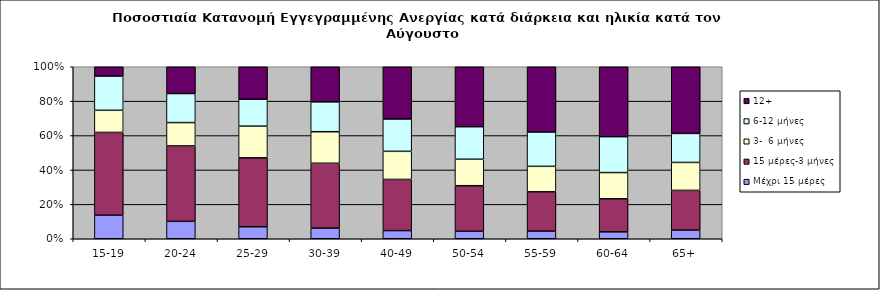
| Category | Μέχρι 15 μέρες | 15 μέρες-3 μήνες | 3-  6 μήνες | 6-12 μήνες | 12+ |
|---|---|---|---|---|---|
| 15-19 | 0.137 | 0.481 | 0.129 | 0.199 | 0.054 |
| 20-24 | 0.101 | 0.438 | 0.136 | 0.169 | 0.156 |
| 25-29 | 0.07 | 0.401 | 0.184 | 0.157 | 0.188 |
| 30-39 | 0.062 | 0.377 | 0.183 | 0.174 | 0.204 |
| 40-49 | 0.048 | 0.297 | 0.163 | 0.188 | 0.303 |
| 50-54 | 0.044 | 0.265 | 0.154 | 0.189 | 0.349 |
| 55-59 | 0.044 | 0.229 | 0.148 | 0.2 | 0.379 |
| 60-64 | 0.04 | 0.192 | 0.152 | 0.209 | 0.406 |
| 65+ | 0.05 | 0.231 | 0.162 | 0.169 | 0.388 |